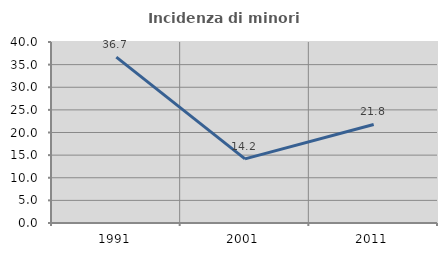
| Category | Incidenza di minori stranieri |
|---|---|
| 1991.0 | 36.667 |
| 2001.0 | 14.173 |
| 2011.0 | 21.781 |